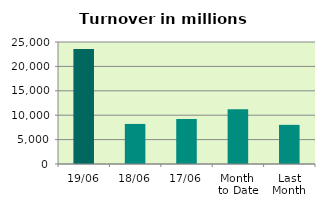
| Category | Series 0 |
|---|---|
| 19/06 | 23573.664 |
| 18/06 | 8211.475 |
| 17/06 | 9216.752 |
| Month 
to Date | 11233.647 |
| Last
Month | 8023.22 |